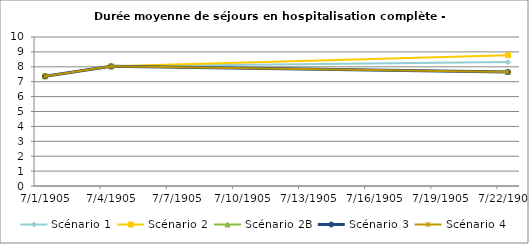
| Category | Scénario 1 | Scénario 2 | Scénario 2B | Scénario 3 | Scénario 4 |
|---|---|---|---|---|---|
| 2009.0 | 7.365 | 7.365 | 7.365 | 7.365 | 7.365 |
| 2012.0 | 8.031 | 8.031 | 8.031 | 8.031 | 8.031 |
| 2030.0 | 8.319 | 8.783 | 7.656 | 7.656 | 7.656 |